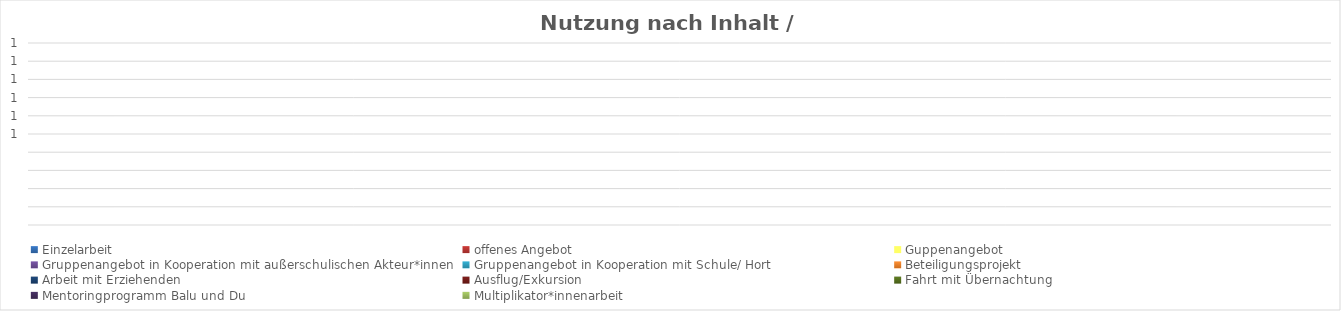
| Category | Einzelarbeit | offenes Angebot | Guppenangebot | Gruppenangebot in Kooperation mit außerschulischen Akteur*innen | Gruppenangebot in Kooperation mit Schule/ Hort | Beteiligungsprojekt | Arbeit mit Erziehenden | Ausflug/Exkursion | Fahrt mit Übernachtung | Mentoringprogramm Balu und Du | Multiplikator*innenarbeit |
|---|---|---|---|---|---|---|---|---|---|---|---|
| 0 | 0 | 0 | 0 | 0 | 0 | 0 | 0 | 0 | 0 | 0 | 0 |